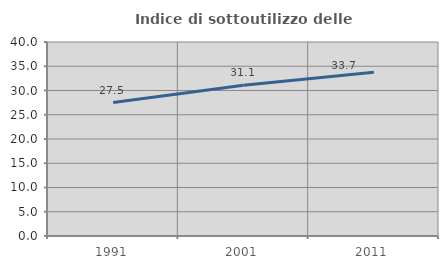
| Category | Indice di sottoutilizzo delle abitazioni  |
|---|---|
| 1991.0 | 27.517 |
| 2001.0 | 31.08 |
| 2011.0 | 33.744 |